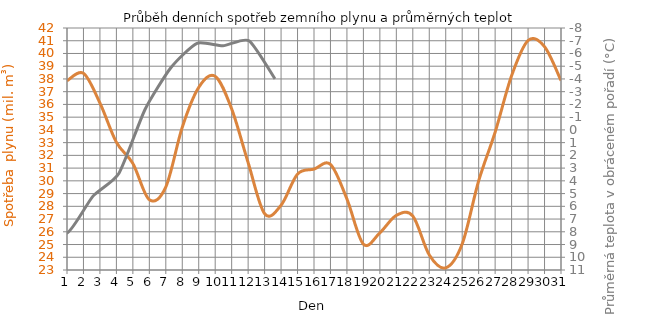
| Category | Spotřeba |
|---|---|
| 1.0 | 37.855 |
| 2.0 | 38.441 |
| 3.0 | 36.11 |
| 4.0 | 33.026 |
| 5.0 | 31.364 |
| 6.0 | 28.518 |
| 7.0 | 29.519 |
| 8.0 | 34.21 |
| 9.0 | 37.339 |
| 10.0 | 38.205 |
| 11.0 | 35.645 |
| 12.0 | 31.431 |
| 13.0 | 27.421 |
| 14.0 | 28.083 |
| 15.0 | 30.53 |
| 16.0 | 30.919 |
| 17.0 | 31.288 |
| 18.0 | 28.573 |
| 19.0 | 25.03 |
| 20.0 | 25.922 |
| 21.0 | 27.286 |
| 22.0 | 27.236 |
| 23.0 | 24.183 |
| 24.0 | 23.168 |
| 25.0 | 25.05 |
| 26.0 | 30.002 |
| 27.0 | 33.82 |
| 28.0 | 38.257 |
| 29.0 | 41.016 |
| 30.0 | 40.532 |
| 31.0 | 37.874 |